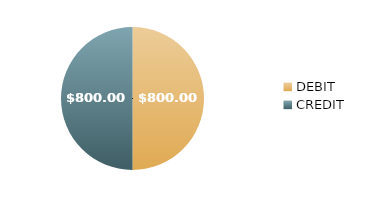
| Category | $800.00 $800.00 |
|---|---|
| DEBIT | 800 |
| CREDIT | 800 |